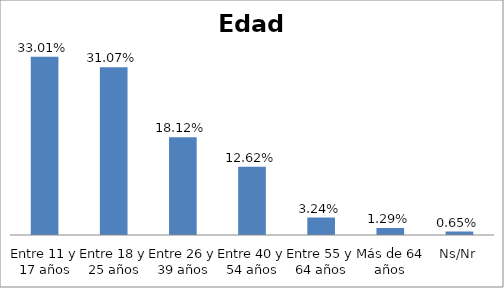
| Category | Series 0 |
|---|---|
| Entre 11 y 17 años | 0.33 |
| Entre 18 y 25 años | 0.311 |
| Entre 26 y 39 años | 0.181 |
| Entre 40 y 54 años | 0.126 |
| Entre 55 y 64 años | 0.032 |
| Más de 64 años | 0.013 |
| Ns/Nr | 0.006 |